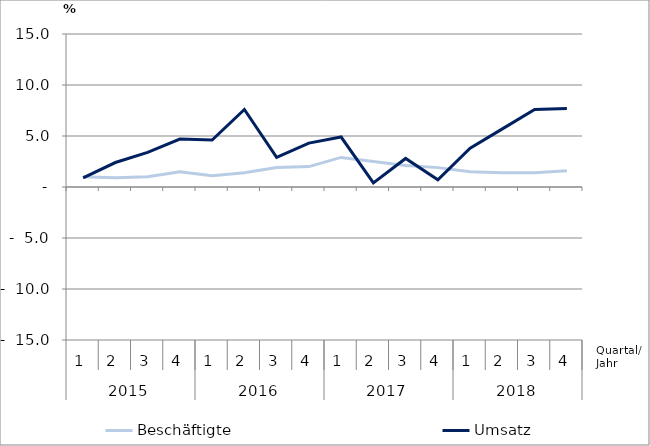
| Category | Beschäftigte | Umsatz |
|---|---|---|
| 0 | 1 | 0.9 |
| 1 | 0.9 | 2.4 |
| 2 | 1 | 3.4 |
| 3 | 1.5 | 4.7 |
| 4 | 1.1 | 4.6 |
| 5 | 1.4 | 7.6 |
| 6 | 1.9 | 2.9 |
| 7 | 2 | 4.3 |
| 8 | 2.9 | 4.9 |
| 9 | 2.5 | 0.4 |
| 10 | 2.1 | 2.8 |
| 11 | 1.9 | 0.7 |
| 12 | 1.5 | 3.8 |
| 13 | 1.4 | 5.7 |
| 14 | 1.4 | 7.6 |
| 15 | 1.6 | 7.7 |